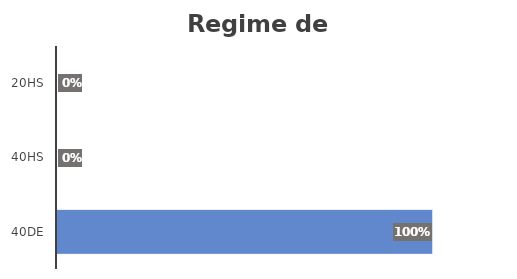
| Category | Series 0 |
|---|---|
| 40DE | 1 |
| 40HS | 0 |
| 20HS | 0 |